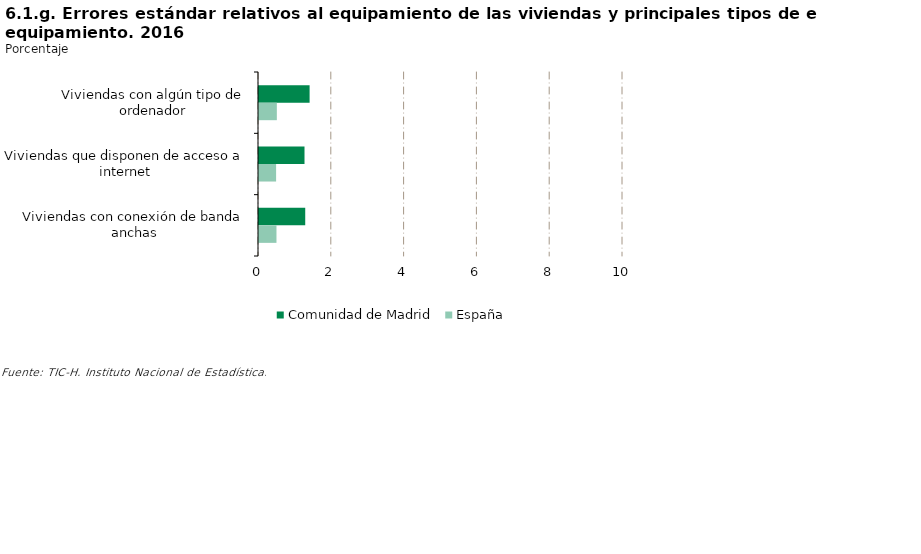
| Category | Comunidad de Madrid | España |
|---|---|---|
| Viviendas con algún tipo de ordenador | 1.39 | 0.49 |
| Viviendas que disponen de acceso a internet | 1.25 | 0.47 |
| Viviendas con conexión de banda anchas | 1.27 | 0.48 |